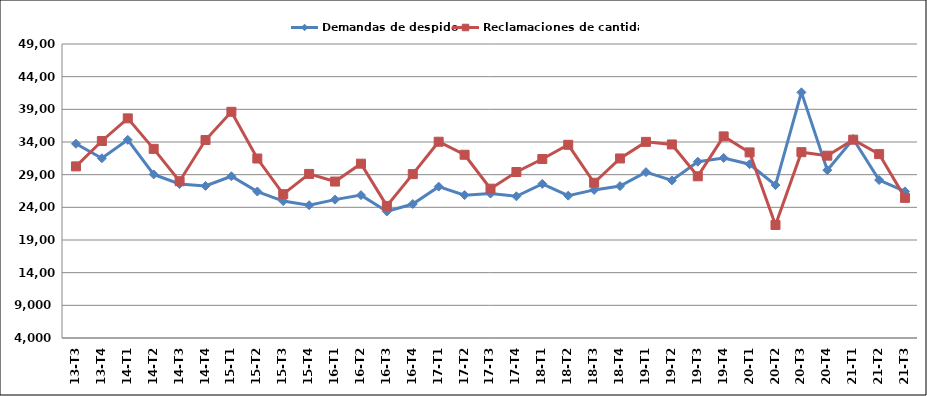
| Category | Demandas de despido | Reclamaciones de cantidad |
|---|---|---|
| 13-T3 | 33730 | 30268 |
| 13-T4 | 31506 | 34154 |
| 14-T1 | 34327 | 37617 |
| 14-T2 | 29037 | 32948 |
| 14-T3 | 27571 | 27999 |
| 14-T4 | 27278 | 34299 |
| 15-T1 | 28755 | 38621 |
| 15-T2 | 26417 | 31470 |
| 15-T3 | 24957 | 26018 |
| 15-T4 | 24328 | 29112 |
| 16-T1 | 25182 | 27945 |
| 16-T2 | 25866 | 30682 |
| 16-T3 | 23364 | 24220 |
| 16-T4 | 24509 | 29081 |
| 17-T1 | 27166 | 34041 |
| 17-T2 | 25869 | 32047 |
| 17-T3 | 26101 | 26854 |
| 17-T4 | 25688 | 29408 |
| 18-T1 | 27589 | 31392 |
| 18-T2 | 25785 | 33573 |
| 18-T3 | 26669 | 27761 |
| 18-T4 | 27251 | 31480 |
| 19-T1 | 29386 | 34020 |
| 19-T2 | 28121 | 33623 |
| 19-T3 | 30981 | 28752 |
| 19-T4 | 31561 | 34857 |
| 20-T1 | 30597 | 32408 |
| 20-T2 | 27401 | 21297 |
| 20-T3 | 41597 | 32446 |
| 20-T4 | 29692 | 31906 |
| 21-T1 | 34461 | 34356 |
| 21-T2 | 28179 | 32151 |
| 21-T3 | 26434 | 25447 |